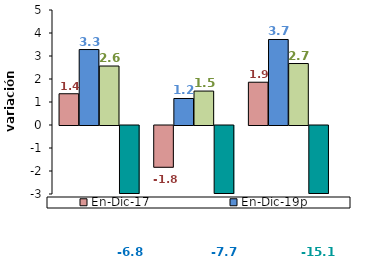
| Category | En-Dic-17 | En-Dic-19p | En-Dic-18 | En-Dic-20pr |
|---|---|---|---|---|
| 0 | 1.359 | 3.281 | 2.564 | -6.847 |
| 1 | -1.816 | 1.153 | 1.475 | -7.714 |
| 2 | 1.86 | 3.718 | 2.673 | -15.083 |